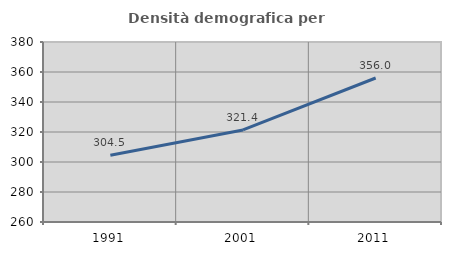
| Category | Densità demografica |
|---|---|
| 1991.0 | 304.534 |
| 2001.0 | 321.383 |
| 2011.0 | 355.992 |